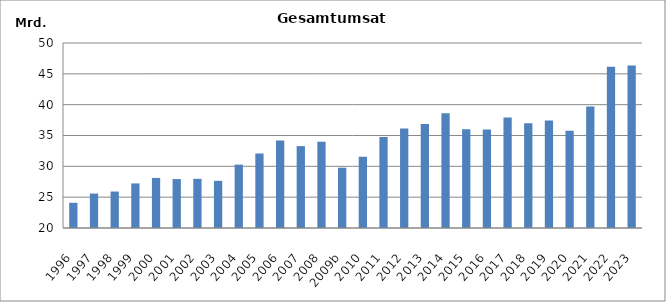
| Category | Series 0 |
|---|---|
| 1996 | 24088396 |
| 1997 | 25588482 |
| 1998 | 25911875 |
| 1999 | 27231996 |
| 2000 | 28121089 |
| 2001 | 27932719 |
| 2002 | 27976228 |
| 2003 | 27652647 |
| 2004 | 30278000 |
| 2005 | 32080721 |
| 2006 | 34189922 |
| 2007 | 33278221 |
| 2008 | 33993013 |
| 2009b | 29783049 |
| 2010 | 31557474.731 |
| 2011 | 34741088 |
| 2012 | 36149532 |
| 2013 | 36865320 |
| 2014 | 38623232.674 |
| 2015 | 36018872 |
| 2016 | 35975244 |
| 2017 | 37901736 |
| 2018 | 36997819 |
| 2019 | 37418803 |
| 2020 | 35788469 |
| 2021 | 39715028.881 |
| 2022 | 46152740.504 |
| 2023 | 46370975.111 |